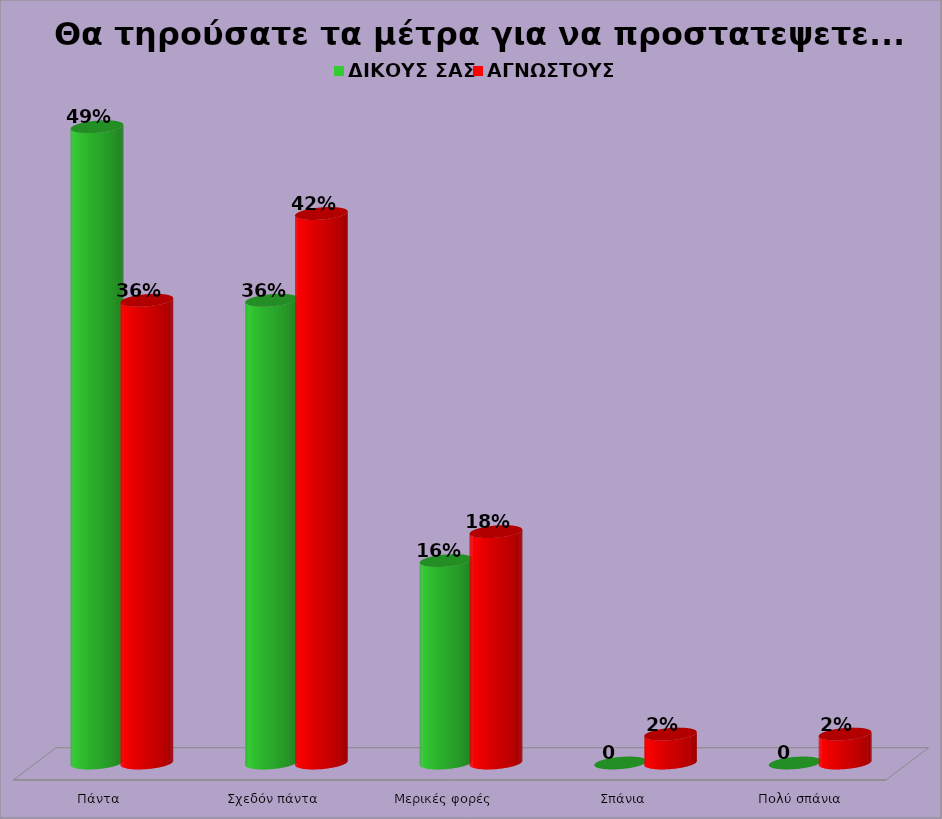
| Category | ΔΙΚΟΥΣ ΣΑΣ | ΑΓΝΩΣΤΟΥΣ |
|---|---|---|
| Πάντα | 48.889 | 35.556 |
| Σχεδόν πάντα | 35.556 | 42.222 |
| Μερικές φορές   | 15.556 | 17.778 |
| Σπάνια | 0 | 2.222 |
|   Πολύ σπάνια | 0 | 2.222 |